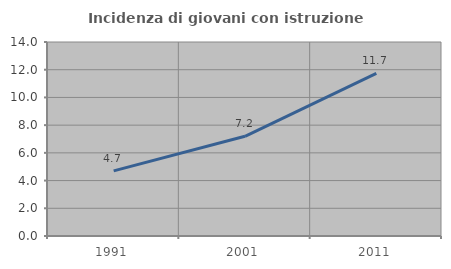
| Category | Incidenza di giovani con istruzione universitaria |
|---|---|
| 1991.0 | 4.698 |
| 2001.0 | 7.194 |
| 2011.0 | 11.737 |